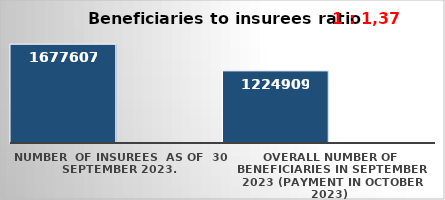
| Category | Series 0 | Series 1 |
|---|---|---|
| NUMBER  of insurees  as of  30 September 2023. | 1677607 |  |
| OVERALL number of beneficiaries in September 2023 (payment in October 2023) | 1224909 |  |